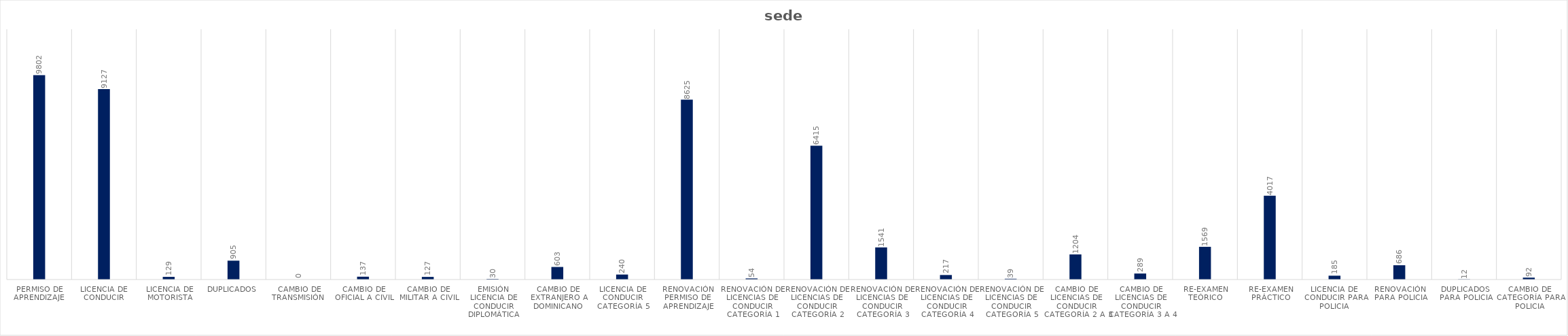
| Category | Series 0 |
|---|---|
| Permiso de Aprendizaje  | 9802 |
| Licencia de  Conducir  | 9127 |
| Licencia de Motorista | 129 |
| Duplicados  | 905 |
| Cambio de Transmisión  | 0 |
| Cambio de Oficial a Civil | 137 |
| Cambio de Militar a Civil | 127 |
| Emisión Licencia de Conducir Diplomática | 30 |
| Cambio de Extranjero a Dominicano | 603 |
| Licencia de Conducir Categoría 5 | 240 |
| Renovación Permiso de Aprendizaje | 8625 |
| Renovación de Licencias de Conducir Categoría 1 | 54 |
| Renovación de Licencias de Conducir Categoría 2 | 6415 |
| Renovación de Licencias de Conducir Categoría 3 | 1541 |
| Renovación de Licencias de Conducir Categoría 4 | 217 |
| Renovación de Licencias de Conducir Categoría 5 | 39 |
| Cambio de Licencias de Conducir Categoría 2 a 3  | 1204 |
| Cambio de Licencias de Conducir Categoría 3 a 4 | 289 |
| Re-Examen Teórico | 1569 |
| Re-Examen Práctico | 4017 |
| Licencia de  Conducir para Policia  | 185 |
| Renovación para Policia | 686 |
| Duplicados para Policia | 12 |
| Cambio de Categoría para Policia | 92 |